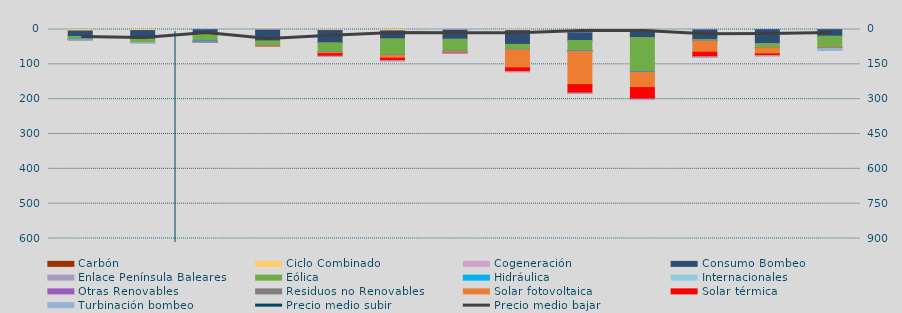
| Category | Carbón | Ciclo Combinado | Cogeneración | Consumo Bombeo | Enlace Península Baleares | Eólica | Hidráulica | Internacionales | Otras Renovables | Residuos no Renovables | Solar fotovoltaica | Solar térmica | Turbinación bombeo |
|---|---|---|---|---|---|---|---|---|---|---|---|---|---|
| 0 | 0 | 4345.9 | 27.314 | 15616.296 | 0 | 6806.453 | 2149.971 | 0 | 152.334 | 42.654 | 44.067 | 19 | 204.333 |
| 1 | 0 | 3059.067 | 0 | 24243.492 | 0 | 10425.232 | 13.796 | 0 | 0 | 0 | 9.194 | 0 | 1113.3 |
| 2 | 0 | 0 | 655.675 | 11045.084 | 0 | 19430.531 | 3297.137 | 0 | 1221.2 | 4.575 | 380.934 | 279.19 | 100 |
| 3 | 0 | 1578.425 | 97.391 | 31105.358 | 0 | 14760.555 | 0.525 | 0 | 6.9 | 0 | 610.128 | 0 | 0 |
| 4 | 0 | 1682.35 | 1288.318 | 35237.998 | 0 | 26715.501 | 538.936 | 0 | 327.466 | 97.457 | 3459.795 | 7401.339 | 450.583 |
| 5 | 0 | 2896.525 | 1320.794 | 22481.384 | 0 | 46423.207 | 245.293 | 0 | 655.227 | 248.362 | 8080.179 | 7222.305 | 292.5 |
| 6 | 0 | 199.85 | 1687.618 | 25714.166 | 0 | 34475.114 | 354.461 | 0 | 851.955 | 108.267 | 3215.484 | 949.057 | 183.208 |
| 7 | 0 | 2332.325 | 837.542 | 39583.668 | 0 | 13865.681 | 874.017 | 0 | 764.251 | 122.4 | 51660.192 | 10959.39 | 140 |
| 8 | 0 | 8570.193 | 1044.542 | 22062.469 | 0 | 29099.06 | 778.521 | 0 | 1951.311 | 135.5 | 94698.2 | 24041.497 | 242.133 |
| 9 | 0 | 898.7 | 918.519 | 21253.542 | 0 | 97910.858 | 671.55 | 0 | 1839.655 | 0 | 43222.778 | 33235.192 | 1586.933 |
| 10 | 0 | 958.3 | 215.177 | 27683.021 | 0 | 3999.405 | 139.925 | 0 | 560.625 | 0 | 31670.609 | 13214.049 | 1776.567 |
| 11 | 0 | 186.85 | 413.567 | 39689.899 | 0 | 12288.729 | 55.808 | 0 | 97.266 | 235.032 | 17134.015 | 4971.407 | 695.217 |
| 12 | 0 | 3.75 | 528.098 | 18641.496 | 0 | 32691.319 | 287.654 | 0 | 22.882 | 0 | 968.157 | 287.639 | 6902.5 |